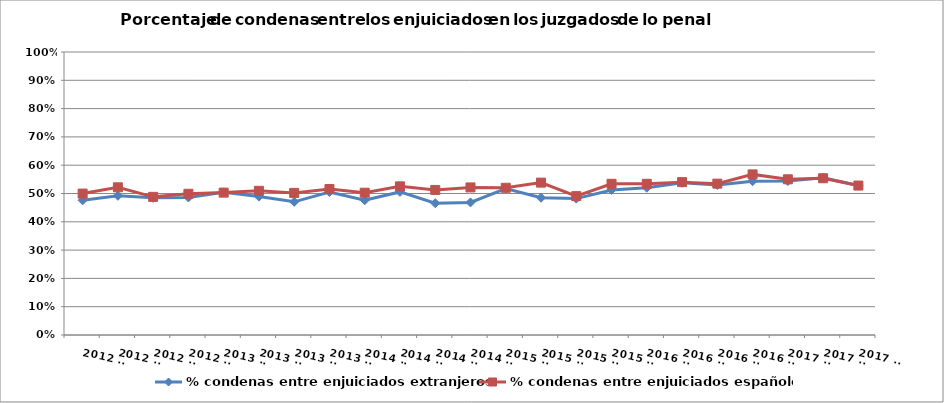
| Category | % condenas entre enjuiciados extranjeros | % condenas entre enjuiciados españoles |
|---|---|---|
| 2012 T1 | 0.476 | 0.5 |
| 2012 T2 | 0.492 | 0.522 |
| 2012 T3 | 0.485 | 0.488 |
| 2012 T4 | 0.486 | 0.499 |
| 2013 T1 | 0.504 | 0.503 |
| 2013 T2 | 0.489 | 0.509 |
| 2013 T3 | 0.471 | 0.502 |
| 2013 T4 | 0.505 | 0.516 |
| 2014 T1 | 0.476 | 0.503 |
| 2014 T2 | 0.506 | 0.525 |
| 2014 T3 | 0.466 | 0.513 |
| 2014 T4 | 0.468 | 0.522 |
| 2015 T1 | 0.518 | 0.52 |
| 2015 T2 | 0.485 | 0.538 |
| 2015 T3 | 0.482 | 0.491 |
| 2015 T4 | 0.513 | 0.534 |
| 2016 T1 | 0.52 | 0.534 |
| 2016 T2 | 0.538 | 0.54 |
| 2016 T3 | 0.53 | 0.535 |
| 2016 T4 | 0.544 | 0.568 |
| 2017 T1 | 0.544 | 0.55 |
| 2017 T2 | 0.555 | 0.554 |
| 2017 T3 | 0.528 | 0.528 |